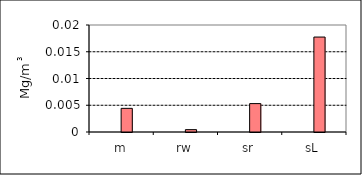
| Category | Series 1 | Series 0 | Series 5 | Series 6 |
|---|---|---|---|---|
| m |  |  | 0.004 |  |
| rw |  |  | 0 |  |
| sr |  |  | 0.005 |  |
| sL |  |  | 0.018 |  |